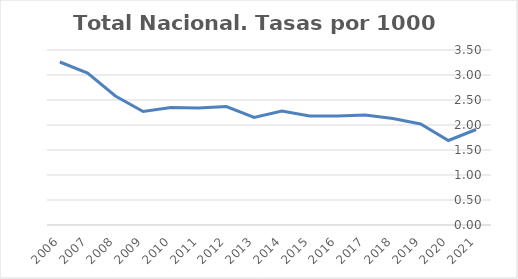
| Category | Total Nacional |
|---|---|
| 2021 | 1.91 |
| 2020 | 1.69 |
| 2019 | 2.02 |
| 2018 | 2.13 |
| 2017 | 2.2 |
| 2016 | 2.18 |
| 2015 | 2.18 |
| 2014 | 2.28 |
| 2013 | 2.15 |
| 2012 | 2.37 |
| 2011 | 2.34 |
| 2010 | 2.35 |
| 2009 | 2.27 |
| 2008 | 2.58 |
| 2007 | 3.04 |
| 2006 | 3.26 |